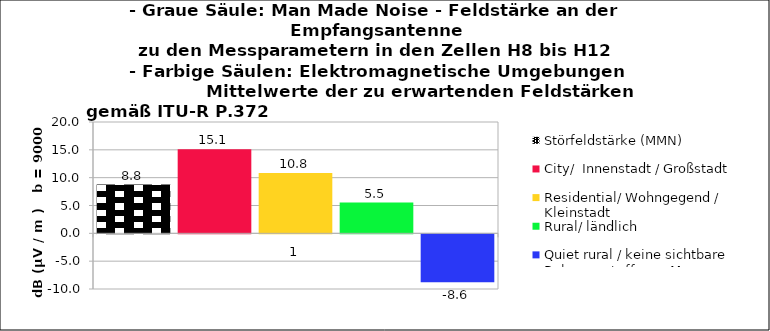
| Category | Störfeldstärke (MMN) | City/  Innenstadt / Großstadt  | Residential/ Wohngegend / Kleinstadt  | Rural/ ländlich  | Quiet rural / keine sichtbare Bebauung/ offenes Meer |
|---|---|---|---|---|---|
| 0 | 8.759 | 15.122 | 10.822 | 5.522 | -8.594 |